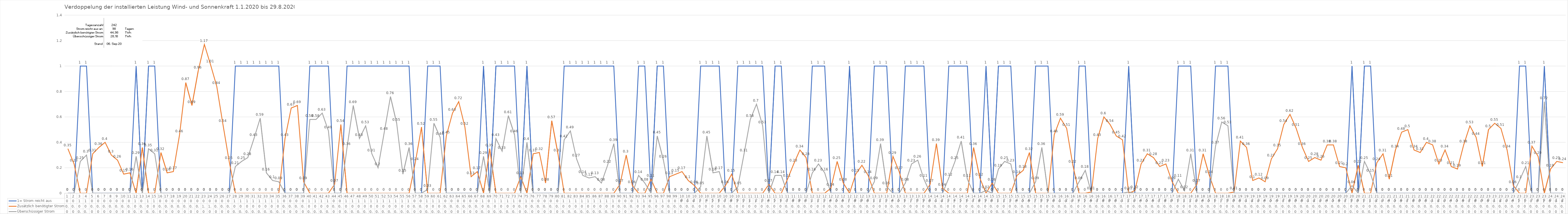
| Category | 1= Strom reicht aus | Zusätzlich benötigter Strom | Überschüssiger Strom |
|---|---|---|---|
| 0 | 0 | 0.35 | 0 |
| 1 | 0 | 0.23 | 0 |
| 2 | 1 | 0 | 0.25 |
| 3 | 1 | 0 | 0.3 |
| 4 | 0 | 0.31 | 0 |
| 5 | 0 | 0.36 | 0 |
| 6 | 0 | 0.4 | 0 |
| 7 | 0 | 0.3 | 0 |
| 8 | 0 | 0.26 | 0 |
| 9 | 0 | 0.15 | 0 |
| 10 | 0 | 0.16 | 0 |
| 11 | 1 | 0 | 0.29 |
| 12 | 0 | 0.36 | 0 |
| 13 | 1 | 0 | 0.35 |
| 14 | 1 | 0 | 0.31 |
| 15 | 0 | 0.32 | 0 |
| 16 | 0 | 0.16 | 0 |
| 17 | 0 | 0.17 | 0 |
| 18 | 0 | 0.46 | 0 |
| 19 | 0 | 0.87 | 0 |
| 20 | 0 | 0.69 | 0 |
| 21 | 0 | 0.96 | 0 |
| 22 | 0 | 1.17 | 0 |
| 23 | 0 | 1.01 | 0 |
| 24 | 0 | 0.84 | 0 |
| 25 | 0 | 0.54 | 0 |
| 26 | 0 | 0.25 | 0 |
| 27 | 1 | 0 | 0.21 |
| 28 | 1 | 0 | 0.25 |
| 29 | 1 | 0 | 0.28 |
| 30 | 1 | 0 | 0.43 |
| 31 | 1 | 0 | 0.59 |
| 32 | 1 | 0 | 0.16 |
| 33 | 1 | 0 | 0.1 |
| 34 | 1 | 0 | 0.09 |
| 35 | 0 | 0.43 | 0 |
| 36 | 0 | 0.67 | 0 |
| 37 | 0 | 0.69 | 0 |
| 38 | 0 | 0.09 | 0 |
| 39 | 1 | 0 | 0.58 |
| 40 | 1 | 0 | 0.58 |
| 41 | 1 | 0 | 0.63 |
| 42 | 1 | 0 | 0.49 |
| 43 | 0 | 0.07 | 0 |
| 44 | 0 | 0.54 | 0 |
| 45 | 1 | 0 | 0.36 |
| 46 | 1 | 0 | 0.69 |
| 47 | 1 | 0 | 0.43 |
| 48 | 1 | 0 | 0.53 |
| 49 | 1 | 0 | 0.31 |
| 50 | 1 | 0 | 0.2 |
| 51 | 1 | 0 | 0.48 |
| 52 | 1 | 0 | 0.76 |
| 53 | 1 | 0 | 0.55 |
| 54 | 1 | 0 | 0.15 |
| 55 | 1 | 0 | 0.36 |
| 56 | 0 | 0.24 | 0 |
| 57 | 0 | 0.52 | 0 |
| 58 | 1 | 0 | 0.03 |
| 59 | 1 | 0 | 0.55 |
| 60 | 1 | 0 | 0.44 |
| 61 | 0 | 0.45 | 0 |
| 62 | 0 | 0.63 | 0 |
| 63 | 0 | 0.72 | 0 |
| 64 | 0 | 0.52 | 0 |
| 65 | 0 | 0.13 | 0 |
| 66 | 0 | 0.17 | 0 |
| 67 | 1 | 0 | 0.29 |
| 68 | 0 | 0.35 | 0 |
| 69 | 1 | 0 | 0.43 |
| 70 | 1 | 0 | 0.33 |
| 71 | 1 | 0 | 0.61 |
| 72 | 1 | 0 | 0.46 |
| 73 | 0 | 0.13 | 0 |
| 74 | 1 | 0 | 0.4 |
| 75 | 0 | 0.31 | 0 |
| 76 | 0 | 0.32 | 0 |
| 77 | 0 | 0.08 | 0 |
| 78 | 0 | 0.57 | 0 |
| 79 | 0 | 0.31 | 0 |
| 80 | 1 | 0 | 0.42 |
| 81 | 1 | 0 | 0.49 |
| 82 | 1 | 0 | 0.27 |
| 83 | 1 | 0 | 0.14 |
| 84 | 1 | 0 | 0.12 |
| 85 | 1 | 0 | 0.13 |
| 86 | 1 | 0 | 0.08 |
| 87 | 1 | 0 | 0.22 |
| 88 | 1 | 0 | 0.39 |
| 89 | 0 | 0.07 | 0 |
| 90 | 0 | 0.3 | 0 |
| 91 | 0 | 0.06 | 0 |
| 92 | 1 | 0 | 0.14 |
| 93 | 1 | 0 | 0.08 |
| 94 | 0 | 0.11 | 0 |
| 95 | 1 | 0 | 0.45 |
| 96 | 1 | 0 | 0.26 |
| 97 | 0 | 0.13 | 0 |
| 98 | 0 | 0.15 | 0 |
| 99 | 0 | 0.17 | 0 |
| 100 | 0 | 0.1 | 0 |
| 101 | 0 | 0.06 | 0 |
| 102 | 1 | 0 | 0.05 |
| 103 | 1 | 0 | 0.45 |
| 104 | 1 | 0 | 0.16 |
| 105 | 1 | 0 | 0.17 |
| 106 | 0 | 0.06 | 0 |
| 107 | 0 | 0.15 | 0 |
| 108 | 1 | 0 | 0.05 |
| 109 | 1 | 0 | 0.31 |
| 110 | 1 | 0 | 0.58 |
| 111 | 1 | 0 | 0.7 |
| 112 | 1 | 0 | 0.53 |
| 113 | 0 | 0.07 | 0 |
| 114 | 1 | 0 | 0.14 |
| 115 | 1 | 0 | 0.14 |
| 116 | 0 | 0.11 | 0 |
| 117 | 0 | 0.23 | 0 |
| 118 | 0 | 0.34 | 0 |
| 119 | 0 | 0.28 | 0 |
| 120 | 1 | 0 | 0.16 |
| 121 | 1 | 0 | 0.23 |
| 122 | 1 | 0 | 0.16 |
| 123 | 0 | 0.04 | 0 |
| 124 | 0 | 0.25 | 0 |
| 125 | 0 | 0.08 | 0 |
| 126 | 1 | 0 | 0 |
| 127 | 0 | 0.15 | 0 |
| 128 | 0 | 0.22 | 0 |
| 129 | 0 | 0.14 | 0 |
| 130 | 1 | 0 | 0.09 |
| 131 | 1 | 0 | 0.39 |
| 132 | 1 | 0 | 0.05 |
| 133 | 0 | 0.29 | 0 |
| 134 | 0 | 0.17 | 0 |
| 135 | 1 | 0 | 0.08 |
| 136 | 1 | 0 | 0.23 |
| 137 | 1 | 0 | 0.26 |
| 138 | 1 | 0 | 0.11 |
| 139 | 0 | 0.07 | 0 |
| 140 | 0 | 0.39 | 0 |
| 141 | 0 | 0.04 | 0 |
| 142 | 1 | 0 | 0.12 |
| 143 | 1 | 0 | 0.25 |
| 144 | 1 | 0 | 0.41 |
| 145 | 1 | 0 | 0.11 |
| 146 | 0 | 0.36 | 0 |
| 147 | 0 | 0.12 | 0 |
| 148 | 1 | 0 | 0.02 |
| 149 | 0 | 0.08 | 0 |
| 150 | 1 | 0 | 0.19 |
| 151 | 1 | 0 | 0.25 |
| 152 | 1 | 0 | 0.23 |
| 153 | 0 | 0.14 | 0 |
| 154 | 0 | 0.18 | 0 |
| 155 | 0 | 0.32 | 0 |
| 156 | 1 | 0 | 0.09 |
| 157 | 1 | 0 | 0.36 |
| 158 | 1 | 0 | 0 |
| 159 | 0 | 0.46 | 0 |
| 160 | 0 | 0.59 | 0 |
| 161 | 0 | 0.51 | 0 |
| 162 | 0 | 0.22 | 0 |
| 163 | 1 | 0 | 0.09 |
| 164 | 1 | 0 | 0.18 |
| 165 | 0 | 0.01 | 0 |
| 166 | 0 | 0.43 | 0 |
| 167 | 0 | 0.6 | 0 |
| 168 | 0 | 0.54 | 0 |
| 169 | 0 | 0.45 | 0 |
| 170 | 0 | 0.42 | 0 |
| 171 | 1 | 0 | 0.01 |
| 172 | 0 | 0.02 | 0 |
| 173 | 0 | 0.23 | 0 |
| 174 | 0 | 0.31 | 0 |
| 175 | 0 | 0.28 | 0 |
| 176 | 0 | 0.21 | 0 |
| 177 | 0 | 0.23 | 0 |
| 178 | 0 | 0.09 | 0 |
| 179 | 1 | 0 | 0.11 |
| 180 | 1 | 0 | 0.02 |
| 181 | 1 | 0 | 0.31 |
| 182 | 0 | 0.07 | 0 |
| 183 | 0 | 0.31 | 0 |
| 184 | 0 | 0.14 | 0 |
| 185 | 1 | 0 | 0.37 |
| 186 | 1 | 0 | 0.56 |
| 187 | 1 | 0 | 0.53 |
| 188 | 0 | 0.01 | 0 |
| 189 | 0 | 0.41 | 0 |
| 190 | 0 | 0.36 | 0 |
| 191 | 0 | 0.1 | 0 |
| 192 | 0 | 0.12 | 0 |
| 193 | 0 | 0.09 | 0 |
| 194 | 0 | 0.27 | 0 |
| 195 | 0 | 0.35 | 0 |
| 196 | 0 | 0.54 | 0 |
| 197 | 0 | 0.62 | 0 |
| 198 | 0 | 0.51 | 0 |
| 199 | 0 | 0.36 | 0 |
| 200 | 0 | 0.25 | 0 |
| 201 | 0 | 0.28 | 0 |
| 202 | 0 | 0.26 | 0 |
| 203 | 0 | 0.38 | 0 |
| 204 | 0 | 0.38 | 0 |
| 205 | 0 | 0.21 | 0 |
| 206 | 0 | 0.2 | 0 |
| 207 | 1 | 0 | 0.06 |
| 208 | 0 | 0.22 | 0 |
| 209 | 1 | 0 | 0.25 |
| 210 | 1 | 0 | 0.15 |
| 211 | 0 | 0.24 | 0 |
| 212 | 0 | 0.31 | 0 |
| 213 | 0 | 0.11 | 0 |
| 214 | 0 | 0.34 | 0 |
| 215 | 0 | 0.48 | 0 |
| 216 | 0 | 0.5 | 0 |
| 217 | 0 | 0.34 | 0 |
| 218 | 0 | 0.32 | 0 |
| 219 | 0 | 0.4 | 0 |
| 220 | 0 | 0.38 | 0 |
| 221 | 0 | 0.23 | 0 |
| 222 | 0 | 0.34 | 0 |
| 223 | 0 | 0.21 | 0 |
| 224 | 0 | 0.19 | 0 |
| 225 | 0 | 0.38 | 0 |
| 226 | 0 | 0.53 | 0 |
| 227 | 0 | 0.44 | 0 |
| 228 | 0 | 0.21 | 0 |
| 229 | 0 | 0.5 | 0 |
| 230 | 0 | 0.55 | 0 |
| 231 | 0 | 0.51 | 0 |
| 232 | 0 | 0.34 | 0 |
| 233 | 0 | 0.06 | 0 |
| 234 | 1 | 0 | 0.1 |
| 235 | 1 | 0 | 0.21 |
| 236 | 0 | 0.37 | 0 |
| 237 | 0 | 0.29 | 0 |
| 238 | 1 | 0 | 0.72 |
| 239 | 0 | 0.19 | 0 |
| 240 | 0 | 0.25 | 0 |
| 241 | 0 | 0.24 | 0 |